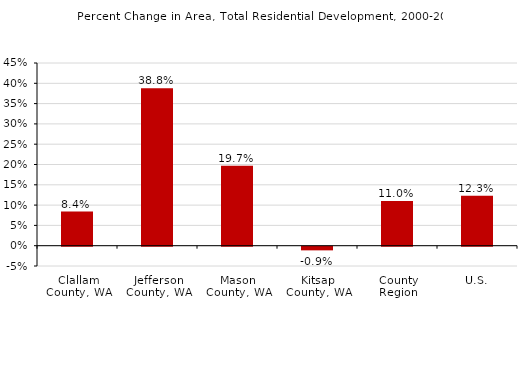
| Category | Percent Change in Total Residential |
|---|---|
| Clallam County, WA | 0.084 |
| Jefferson County, WA | 0.388 |
| Mason County, WA | 0.197 |
| Kitsap County, WA | -0.009 |
| County Region | 0.11 |
| U.S. | 0.123 |